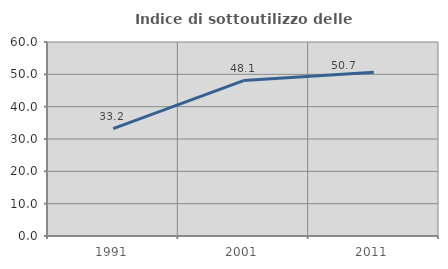
| Category | Indice di sottoutilizzo delle abitazioni  |
|---|---|
| 1991.0 | 33.184 |
| 2001.0 | 48.069 |
| 2011.0 | 50.655 |